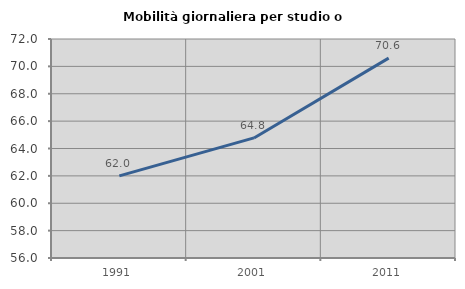
| Category | Mobilità giornaliera per studio o lavoro |
|---|---|
| 1991.0 | 62 |
| 2001.0 | 64.773 |
| 2011.0 | 70.603 |